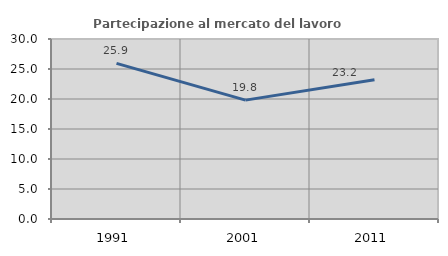
| Category | Partecipazione al mercato del lavoro  femminile |
|---|---|
| 1991.0 | 25.939 |
| 2001.0 | 19.814 |
| 2011.0 | 23.193 |